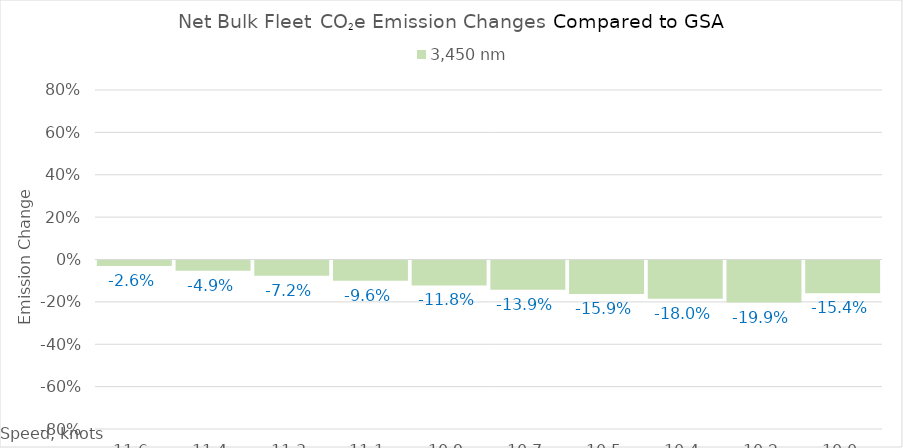
| Category | 3,450 |
|---|---|
| 11.620000000000001 | -0.026 |
| 11.440000000000001 | -0.049 |
| 11.260000000000002 | -0.072 |
| 11.080000000000002 | -0.096 |
| 10.900000000000002 | -0.118 |
| 10.720000000000002 | -0.139 |
| 10.540000000000003 | -0.159 |
| 10.360000000000003 | -0.18 |
| 10.180000000000003 | -0.199 |
| 10.000000000000004 | -0.154 |